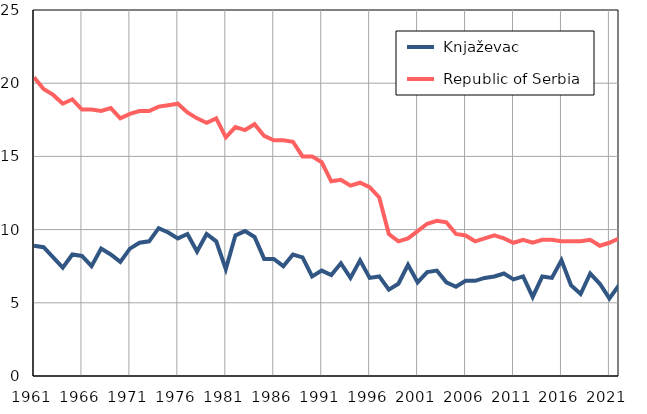
| Category |  Knjaževac |  Republic of Serbia |
|---|---|---|
| 1961.0 | 8.9 | 20.4 |
| 1962.0 | 8.8 | 19.6 |
| 1963.0 | 8.1 | 19.2 |
| 1964.0 | 7.4 | 18.6 |
| 1965.0 | 8.3 | 18.9 |
| 1966.0 | 8.2 | 18.2 |
| 1967.0 | 7.5 | 18.2 |
| 1968.0 | 8.7 | 18.1 |
| 1969.0 | 8.3 | 18.3 |
| 1970.0 | 7.8 | 17.6 |
| 1971.0 | 8.7 | 17.9 |
| 1972.0 | 9.1 | 18.1 |
| 1973.0 | 9.2 | 18.1 |
| 1974.0 | 10.1 | 18.4 |
| 1975.0 | 9.8 | 18.5 |
| 1976.0 | 9.4 | 18.6 |
| 1977.0 | 9.7 | 18 |
| 1978.0 | 8.5 | 17.6 |
| 1979.0 | 9.7 | 17.3 |
| 1980.0 | 9.2 | 17.6 |
| 1981.0 | 7.3 | 16.3 |
| 1982.0 | 9.6 | 17 |
| 1983.0 | 9.9 | 16.8 |
| 1984.0 | 9.5 | 17.2 |
| 1985.0 | 8 | 16.4 |
| 1986.0 | 8 | 16.1 |
| 1987.0 | 7.5 | 16.1 |
| 1988.0 | 8.3 | 16 |
| 1989.0 | 8.1 | 15 |
| 1990.0 | 6.8 | 15 |
| 1991.0 | 7.2 | 14.6 |
| 1992.0 | 6.9 | 13.3 |
| 1993.0 | 7.7 | 13.4 |
| 1994.0 | 6.7 | 13 |
| 1995.0 | 7.9 | 13.2 |
| 1996.0 | 6.7 | 12.9 |
| 1997.0 | 6.8 | 12.2 |
| 1998.0 | 5.9 | 9.7 |
| 1999.0 | 6.3 | 9.2 |
| 2000.0 | 7.6 | 9.4 |
| 2001.0 | 6.4 | 9.9 |
| 2002.0 | 7.1 | 10.4 |
| 2003.0 | 7.2 | 10.6 |
| 2004.0 | 6.4 | 10.5 |
| 2005.0 | 6.1 | 9.7 |
| 2006.0 | 6.5 | 9.6 |
| 2007.0 | 6.5 | 9.2 |
| 2008.0 | 6.7 | 9.4 |
| 2009.0 | 6.8 | 9.6 |
| 2010.0 | 7 | 9.4 |
| 2011.0 | 6.6 | 9.1 |
| 2012.0 | 6.8 | 9.3 |
| 2013.0 | 5.4 | 9.1 |
| 2014.0 | 6.8 | 9.3 |
| 2015.0 | 6.7 | 9.3 |
| 2016.0 | 7.9 | 9.2 |
| 2017.0 | 6.2 | 9.2 |
| 2018.0 | 5.6 | 9.2 |
| 2019.0 | 7 | 9.3 |
| 2020.0 | 6.3 | 8.9 |
| 2021.0 | 5.3 | 9.1 |
| 2022.0 | 6.2 | 9.4 |